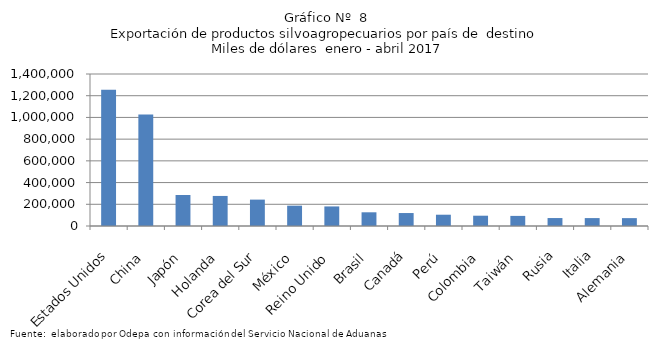
| Category | Series 0 |
|---|---|
| Estados Unidos | 1254899.696 |
| China | 1028052.695 |
| Japón | 285785.307 |
| Holanda | 276854.405 |
| Corea del Sur | 243019.735 |
| México | 187242.188 |
| Reino Unido | 180192.336 |
| Brasil | 126206.63 |
| Canadá | 119385.764 |
| Perú | 103929.731 |
| Colombia | 94826.233 |
| Taiwán | 93015.109 |
| Rusia | 73266.031 |
| Italia | 72889.937 |
| Alemania | 72564.481 |